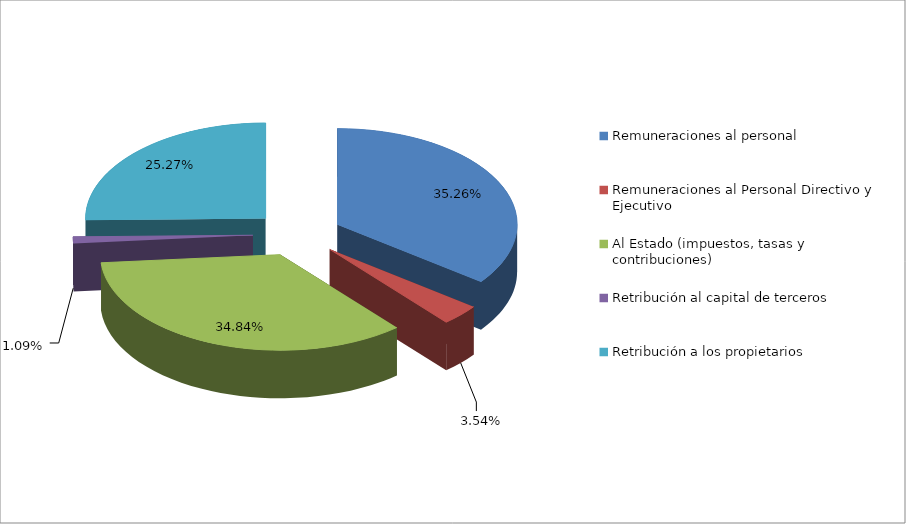
| Category | Series 0 |
|---|---|
| Remuneraciones al personal | 0.353 |
| Remuneraciones al Personal Directivo y Ejecutivo | 0.035 |
| Al Estado (impuestos, tasas y contribuciones) | 0.348 |
| Retribución al capital de terceros | 0.011 |
| Retribución a los propietarios | 0.253 |